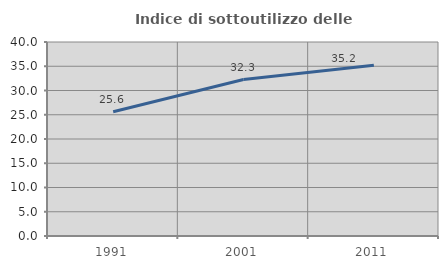
| Category | Indice di sottoutilizzo delle abitazioni  |
|---|---|
| 1991.0 | 25.632 |
| 2001.0 | 32.258 |
| 2011.0 | 35.222 |